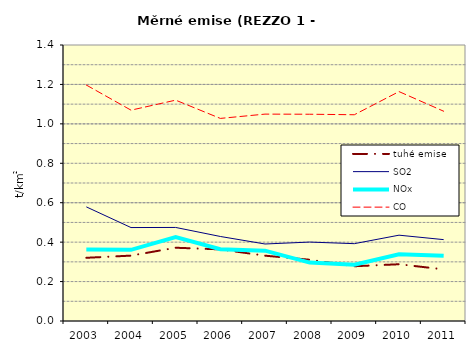
| Category | tuhé emise | SO2 | NOx | CO |
|---|---|---|---|---|
| 2003.0 | 0.321 | 0.579 | 0.363 | 1.197 |
| 2004.0 | 0.332 | 0.474 | 0.361 | 1.069 |
| 2005.0 | 0.372 | 0.475 | 0.425 | 1.12 |
| 2006.0 | 0.363 | 0.429 | 0.364 | 1.028 |
| 2007.0 | 0.331 | 0.391 | 0.357 | 1.049 |
| 2008.0 | 0.311 | 0.4 | 0.296 | 1.049 |
| 2009.0 | 0.278 | 0.392 | 0.285 | 1.046 |
| 2010.0 | 0.288 | 0.435 | 0.338 | 1.164 |
| 2011.0 | 0.262 | 0.413 | 0.331 | 1.064 |